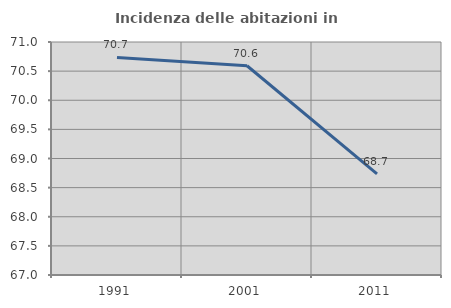
| Category | Incidenza delle abitazioni in proprietà  |
|---|---|
| 1991.0 | 70.735 |
| 2001.0 | 70.592 |
| 2011.0 | 68.735 |